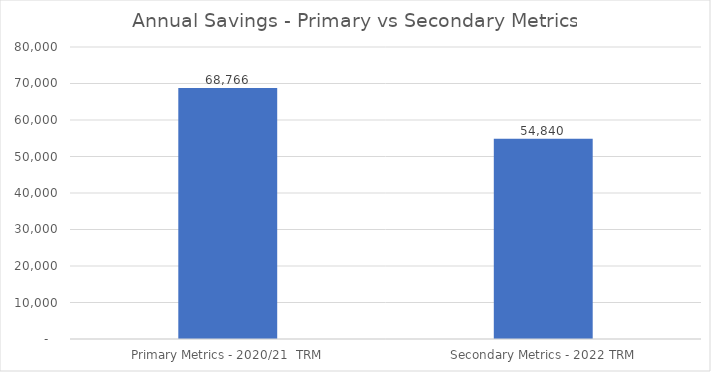
| Category | Series 0 |
|---|---|
|  Primary Metrics - 2020/21  TRM  | 68765.68 |
|  Secondary Metrics - 2022 TRM  | 54839.803 |